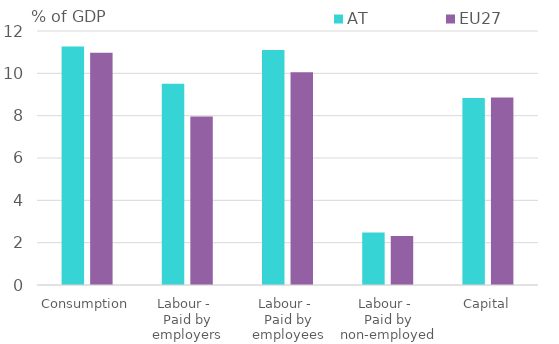
| Category | AT | EU27 |
|---|---|---|
| Consumption | 11.265 | 10.967 |
| Labour - 
Paid by employers | 9.512 | 7.966 |
| Labour - 
Paid by employees | 11.098 | 10.052 |
| Labour - 
Paid by non-employed | 2.479 | 2.311 |
| Capital | 8.833 | 8.858 |